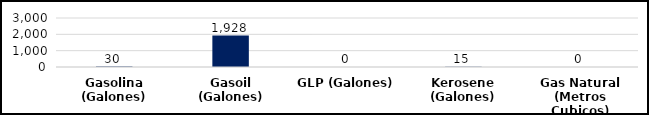
| Category | Series 0 |
|---|---|
| Gasolina (Galones) | 30 |
| Gasoil (Galones) | 1928 |
| GLP (Galones) | 0 |
| Kerosene (Galones) | 15 |
| Gas Natural (Metros Cubicos) | 0 |